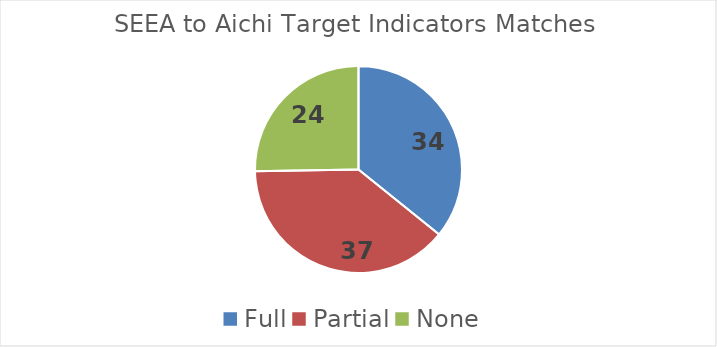
| Category | Series 0 |
|---|---|
| Full | 34 |
| Partial | 37 |
| None | 24 |